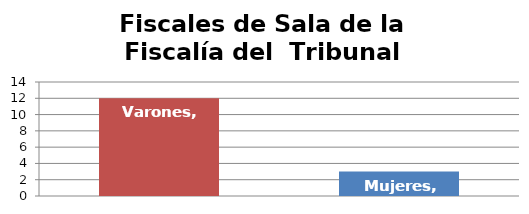
| Category | Fiscales de Sala de la Fiscalía del  Tribunal Supremo |
|---|---|
| Varones | 12 |
| Mujeres | 3 |